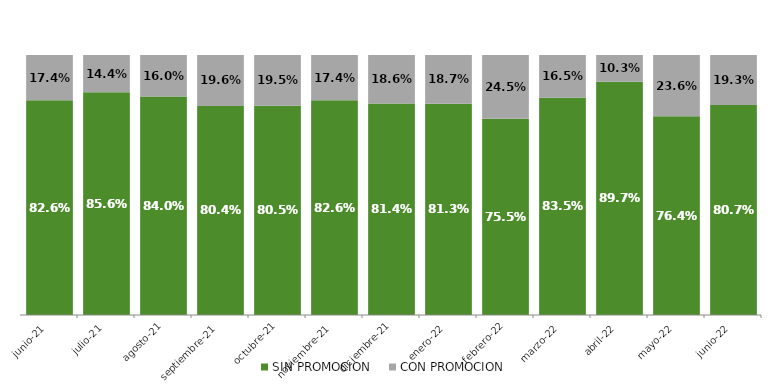
| Category | SIN PROMOCION   | CON PROMOCION   |
|---|---|---|
| 2021-06-01 | 0.826 | 0.174 |
| 2021-07-01 | 0.856 | 0.144 |
| 2021-08-01 | 0.84 | 0.16 |
| 2021-09-01 | 0.804 | 0.196 |
| 2021-10-01 | 0.805 | 0.195 |
| 2021-11-01 | 0.826 | 0.174 |
| 2021-12-01 | 0.814 | 0.186 |
| 2022-01-01 | 0.813 | 0.187 |
| 2022-02-01 | 0.755 | 0.245 |
| 2022-03-01 | 0.835 | 0.165 |
| 2022-04-01 | 0.897 | 0.103 |
| 2022-05-01 | 0.764 | 0.236 |
| 2022-06-01 | 0.807 | 0.193 |